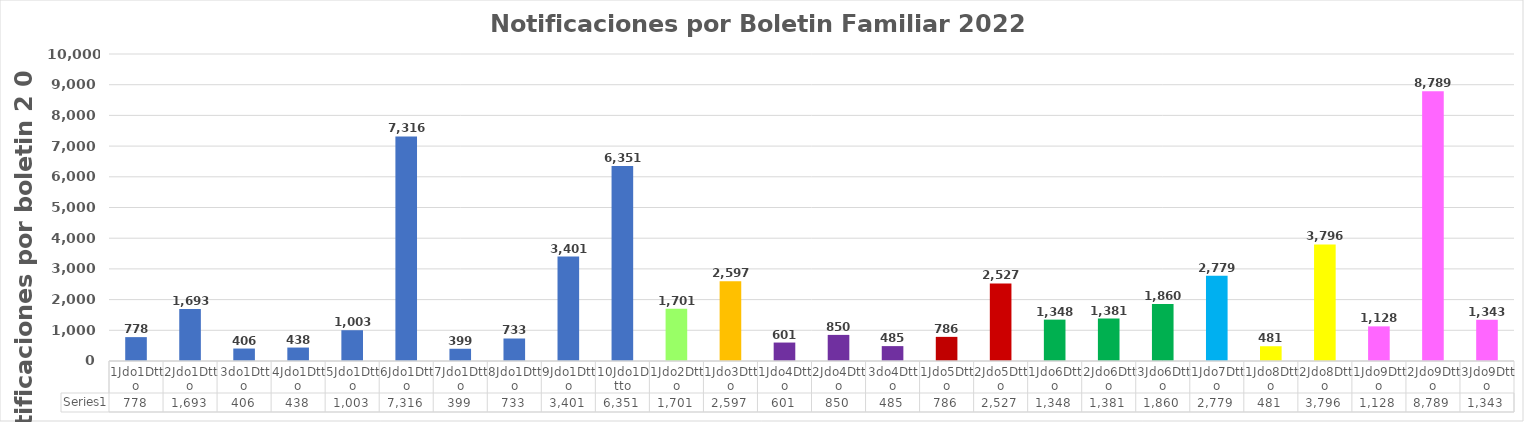
| Category | Series 0 |
|---|---|
| 1Jdo1Dtto | 778 |
| 2Jdo1Dtto | 1693 |
| 3do1Dtto | 406 |
| 4Jdo1Dtto | 438 |
| 5Jdo1Dtto | 1003 |
| 6Jdo1Dtto | 7316 |
| 7Jdo1Dtto | 399 |
| 8Jdo1Dtto | 733 |
| 9Jdo1Dtto | 3401 |
| 10Jdo1Dtto | 6351 |
| 1Jdo2Dtto | 1701 |
| 1Jdo3Dtto | 2597 |
| 1Jdo4Dtto | 601 |
| 2Jdo4Dtto | 850 |
| 3do4Dtto | 485 |
| 1Jdo5Dtto | 786 |
| 2Jdo5Dtto | 2527 |
| 1Jdo6Dtto | 1348 |
| 2Jdo6Dtto | 1381 |
| 3Jdo6Dtto | 1860 |
| 1Jdo7Dtto | 2779 |
| 1Jdo8Dtto | 481 |
| 2Jdo8Dtto | 3796 |
| 1Jdo9Dtto | 1128 |
| 2Jdo9Dtto | 8789 |
| 3Jdo9Dtto | 1343 |